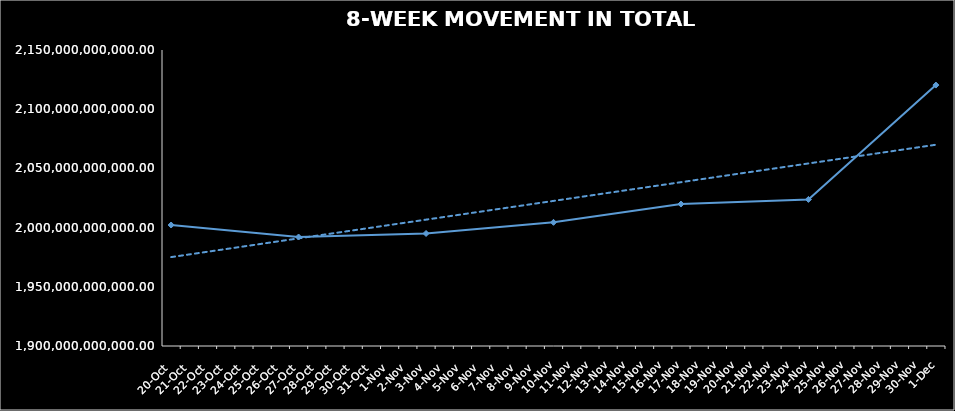
| Category | TOTAL NAV |
|---|---|
| 2023-10-20 | 2002190167303.245 |
| 2023-10-27 | 1992052361749.948 |
| 2023-11-03 | 1995029350611.796 |
| 2023-11-10 | 2004454649356.778 |
| 2023-11-17 | 2019879952817.294 |
| 2023-11-24 | 2023797867882.851 |
| 2023-12-01 | 2120381651104.615 |